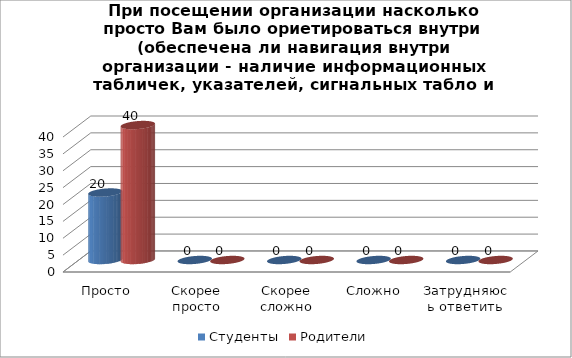
| Category | Студенты | Родители |
|---|---|---|
| Просто | 20 | 40 |
| Скорее просто | 0 | 0 |
| Скорее сложно | 0 | 0 |
| Сложно | 0 | 0 |
| Затрудняюсь ответить | 0 | 0 |